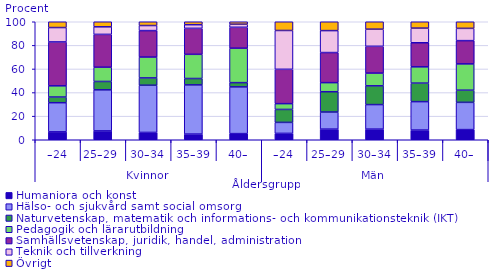
| Category | Humaniora och konst                                                                                                                                    | Hälso- och sjukvård samt social omsorg                                                                                                                 | Naturvetenskap, matematik och informations- och kommunikationsteknik (IKT)                                                                             | Pedagogik och lärarutbildning                                                                                                                          | Samhällsvetenskap, juridik, handel, administration                                                                                                     | Teknik och tillverkning                                                                                                                                | Övrigt |
|---|---|---|---|---|---|---|---|
| 0 | 6.7 | 24.7 | 4.8 | 9.5 | 37.2 | 12.2 | 5.6 |
| 1 | 7.5 | 34.8 | 7.1 | 12.1 | 27.8 | 6.4 | 5 |
| 2 | 6.2 | 40 | 6.2 | 17.7 | 22.4 | 4.3 | 4.1 |
| 3 | 4.8 | 41.7 | 5.4 | 20.5 | 22 | 3.1 | 3.4 |
| 4 | 5.2 | 39.6 | 3.6 | 29.2 | 17.7 | 2.6 | 2.9 |
| 5 | 5.4 | 9.3 | 11 | 4.9 | 29.1 | 32.9 | 8 |
| 6 | 9 | 14.5 | 17.2 | 7.7 | 25.5 | 18.6 | 7.9 |
| 7 | 9 | 20.8 | 15.9 | 10.8 | 22.7 | 14.5 | 6.9 |
| 8 | 8.2 | 24.1 | 15.7 | 13.8 | 20.4 | 12.4 | 6.2 |
| 9 | 8.6 | 23.1 | 10.3 | 22.3 | 19.7 | 10.4 | 6.1 |